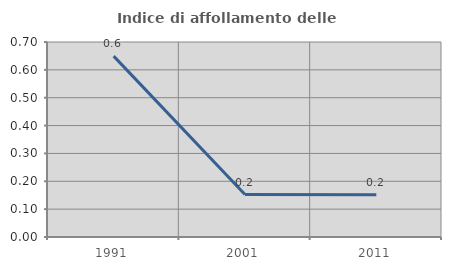
| Category | Indice di affollamento delle abitazioni  |
|---|---|
| 1991.0 | 0.649 |
| 2001.0 | 0.152 |
| 2011.0 | 0.152 |